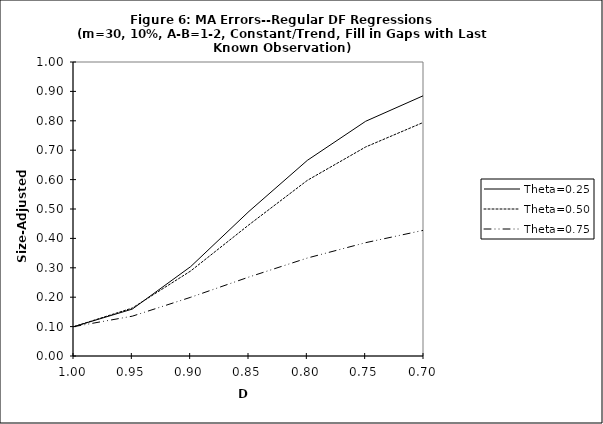
| Category | Theta=0.25 | Theta=0.50 | Theta=0.75 |
|---|---|---|---|
| 1.0 | 0.1 | 0.1 | 0.1 |
| 0.95 | 0.16 | 0.163 | 0.136 |
| 0.9 | 0.304 | 0.289 | 0.2 |
| 0.85 | 0.492 | 0.446 | 0.269 |
| 0.8 | 0.665 | 0.597 | 0.333 |
| 0.75 | 0.798 | 0.711 | 0.386 |
| 0.7 | 0.886 | 0.796 | 0.428 |